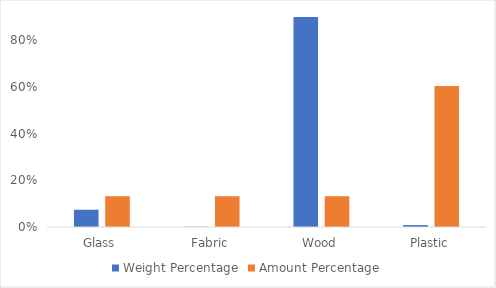
| Category | Weight Percentage | Amount Percentage |
|---|---|---|
| Glass | 0.074 | 0.132 |
| Fabric | 0.001 | 0.132 |
| Wood | 0.917 | 0.132 |
| Plastic | 0.008 | 0.604 |